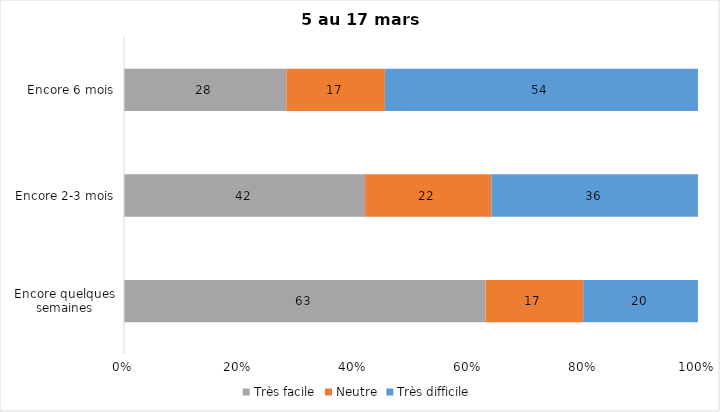
| Category | Très facile | Neutre | Très difficile |
|---|---|---|---|
| Encore quelques semaines | 63 | 17 | 20 |
| Encore 2-3 mois | 42 | 22 | 36 |
| Encore 6 mois | 28 | 17 | 54 |